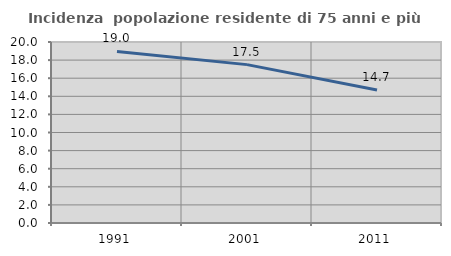
| Category | Incidenza  popolazione residente di 75 anni e più |
|---|---|
| 1991.0 | 18.952 |
| 2001.0 | 17.5 |
| 2011.0 | 14.706 |